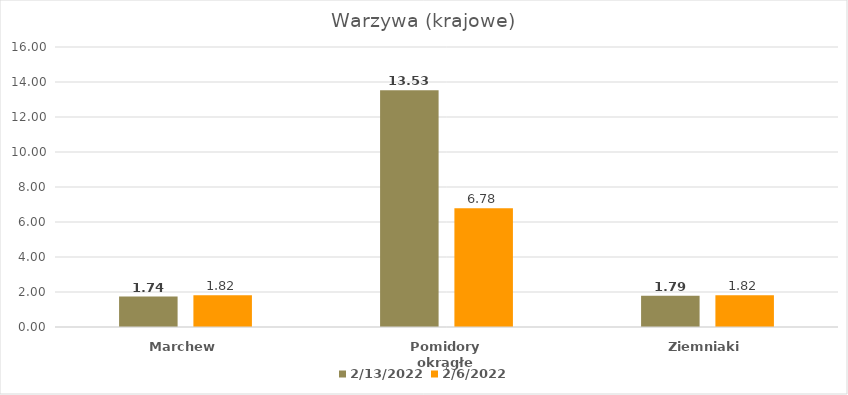
| Category | 13.02.2022 | 06.02.2022 |
|---|---|---|
| Marchew | 1.74 | 1.82 |
| Pomidory okrągłe | 13.53 | 6.783 |
| Ziemniaki | 1.79 | 1.816 |